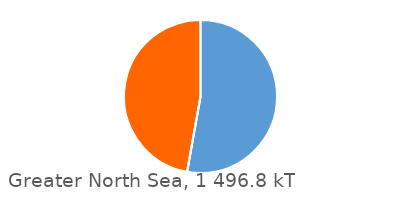
| Category | Greater North Sea |
|---|---|
| 0 | 790426 |
| 1 | 0 |
| 2 | 706405 |